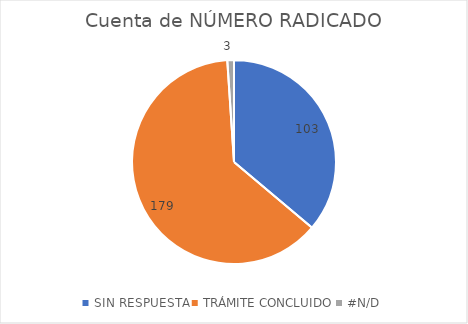
| Category | Cuenta de NÚMERO RADICADO |
|---|---|
| SIN RESPUESTA | 103 |
| TRÁMITE CONCLUIDO | 179 |
| #N/D | 3 |